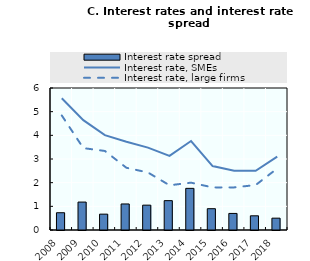
| Category | Interest rate spread |
|---|---|
| 2008.0 | 0.73 |
| 2009.0 | 1.18 |
| 2010.0 | 0.67 |
| 2011.0 | 1.1 |
| 2012.0 | 1.05 |
| 2013.0 | 1.24 |
| 2014.0 | 1.76 |
| 2015.0 | 0.9 |
| 2016.0 | 0.7 |
| 2017.0 | 0.6 |
| 2018.0 | 0.5 |